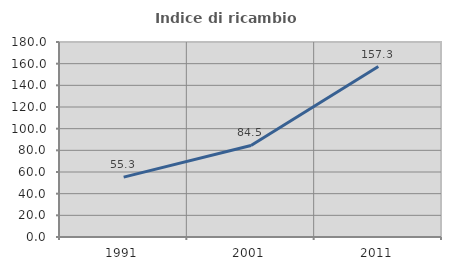
| Category | Indice di ricambio occupazionale  |
|---|---|
| 1991.0 | 55.263 |
| 2001.0 | 84.466 |
| 2011.0 | 157.303 |